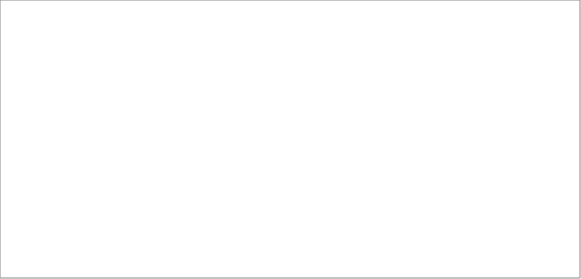
| Category | 2008 | 2009 |
|---|---|---|
| Armenia | 11660 | 5768 |